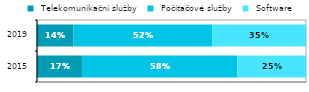
| Category |  Telekomunikační služby |  Počítačové služby |  Software |
|---|---|---|---|
| 2015.0 | 0.167 | 0.578 | 0.255 |
| 2019.0 | 0.136 | 0.515 | 0.349 |